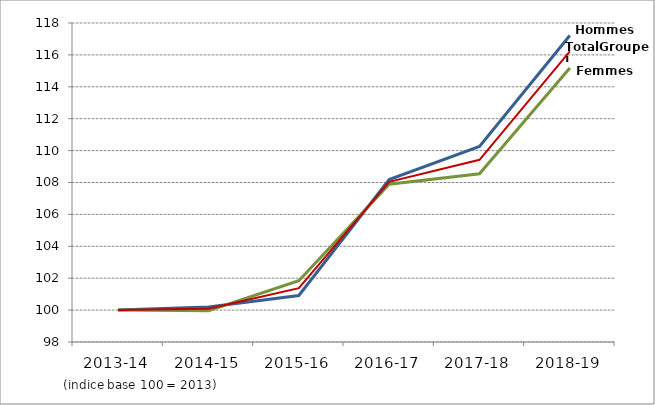
| Category | Series 1 | Series 2 | Series 3 |
|---|---|---|---|
| 2013-14 | 100 | 100 | 100 |
| 2014-15 | 100.195 | 99.959 | 100.08 |
| 2015-16 | 100.917 | 101.844 | 101.372 |
| 2016-17 | 108.181 | 107.894 | 108.04 |
| 2017-18 | 110.259 | 108.551 | 109.421 |
| 2018-19 | 117.219 | 115.181 | 116.219 |